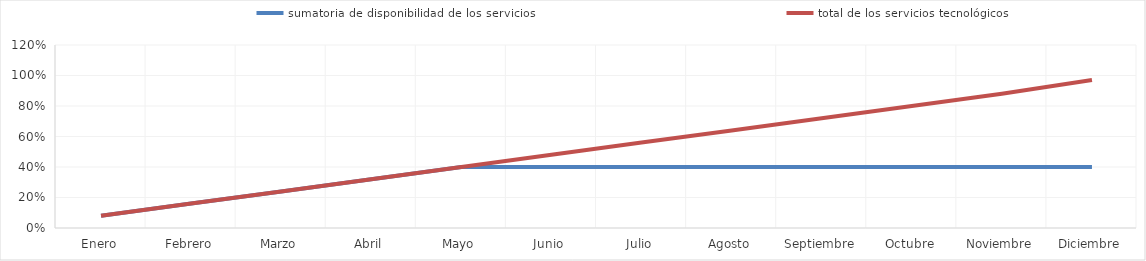
| Category | sumatoria de disponibilidad de los servicios | total de los servicios tecnológicos |
|---|---|---|
| 0 | 0.08 | 0.08 |
| 1 | 0.16 | 0.16 |
| 2 | 0.24 | 0.24 |
| 3 | 0.32 | 0.32 |
| 4 | 0.4 | 0.4 |
| 5 | 0.4 | 0.48 |
| 6 | 0.4 | 0.56 |
| 7 | 0.4 | 0.64 |
| 8 | 0.4 | 0.72 |
| 9 | 0.4 | 0.8 |
| 10 | 0.4 | 0.88 |
| 11 | 0.4 | 0.97 |